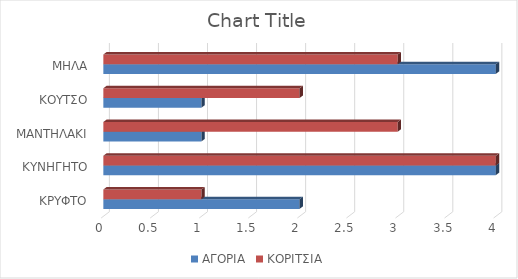
| Category | ΑΓΟΡΙΑ | ΚΟΡΙΤΣΙΑ |
|---|---|---|
| ΚΡΥΦΤΟ | 2 | 1 |
| ΚΥΝΗΓΗΤΟ | 4 | 4 |
| ΜΑΝΤΗΛΑΚΙ | 1 | 3 |
| ΚΟΥΤΣΟ | 1 | 2 |
| ΜΗΛΑ | 4 | 3 |